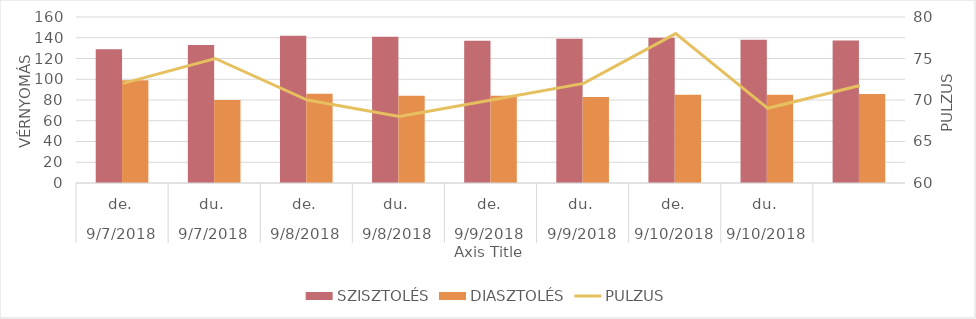
| Category | SZISZTOLÉS | DIASZTOLÉS |
|---|---|---|
| 0 | 129 | 99 |
| 1/1/00 | 133 | 80 |
| 1/2/00 | 142 | 86 |
| 1/3/00 | 141 | 84 |
| 1/4/00 | 137 | 84 |
| 1/5/00 | 139 | 83 |
| 1/6/00 | 140 | 85 |
| 1/7/00 | 138 | 85 |